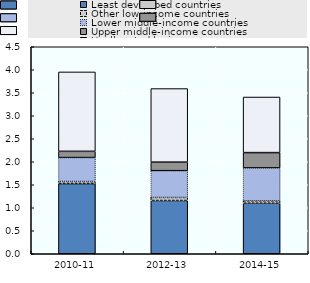
| Category | Least developed countries | Other low-income countries | Lower middle-income countries | Upper middle-income countries | Unallocated by income |
|---|---|---|---|---|---|
| 2010-11 | 1525.13 | 45.705 | 520.485 | 135.495 | 1726.065 |
| 2012-13 | 1158.214 | 65.836 | 581.987 | 186.061 | 1599.208 |
| 2014-15 | 1097.913 | 53.732 | 714.66 | 332.474 | 1208.713 |